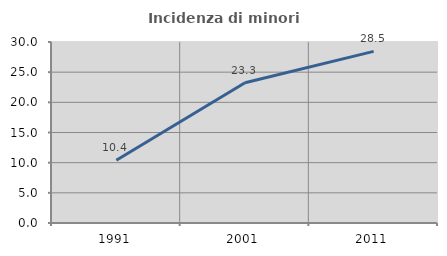
| Category | Incidenza di minori stranieri |
|---|---|
| 1991.0 | 10.39 |
| 2001.0 | 23.256 |
| 2011.0 | 28.451 |